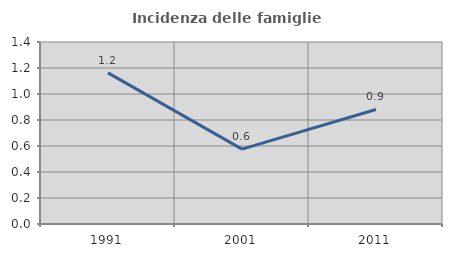
| Category | Incidenza delle famiglie numerose |
|---|---|
| 1991.0 | 1.163 |
| 2001.0 | 0.576 |
| 2011.0 | 0.881 |